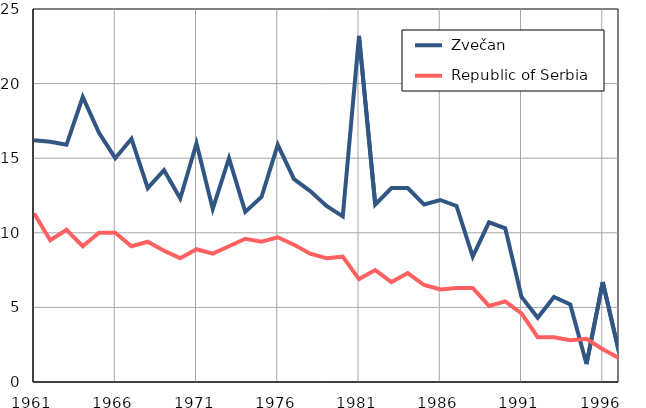
| Category |  Zvečan |  Republic of Serbia |
|---|---|---|
| 1961.0 | 16.2 | 11.3 |
| 1962.0 | 16.1 | 9.5 |
| 1963.0 | 15.9 | 10.2 |
| 1964.0 | 19.1 | 9.1 |
| 1965.0 | 16.7 | 10 |
| 1966.0 | 15 | 10 |
| 1967.0 | 16.3 | 9.1 |
| 1968.0 | 13 | 9.4 |
| 1969.0 | 14.2 | 8.8 |
| 1970.0 | 12.3 | 8.3 |
| 1971.0 | 16 | 8.9 |
| 1972.0 | 11.6 | 8.6 |
| 1973.0 | 15 | 9.1 |
| 1974.0 | 11.4 | 9.6 |
| 1975.0 | 12.4 | 9.4 |
| 1976.0 | 15.9 | 9.7 |
| 1977.0 | 13.6 | 9.2 |
| 1978.0 | 12.8 | 8.6 |
| 1979.0 | 11.8 | 8.3 |
| 1980.0 | 11.1 | 8.4 |
| 1981.0 | 23.2 | 6.9 |
| 1982.0 | 11.9 | 7.5 |
| 1983.0 | 13 | 6.7 |
| 1984.0 | 13 | 7.3 |
| 1985.0 | 11.9 | 6.5 |
| 1986.0 | 12.2 | 6.2 |
| 1987.0 | 11.8 | 6.3 |
| 1988.0 | 8.4 | 6.3 |
| 1989.0 | 10.7 | 5.1 |
| 1990.0 | 10.3 | 5.4 |
| 1991.0 | 5.7 | 4.6 |
| 1992.0 | 4.3 | 3 |
| 1993.0 | 5.7 | 3 |
| 1994.0 | 5.2 | 2.8 |
| 1995.0 | 1.2 | 2.9 |
| 1996.0 | 6.7 | 2.2 |
| 1997.0 | 2 | 1.6 |